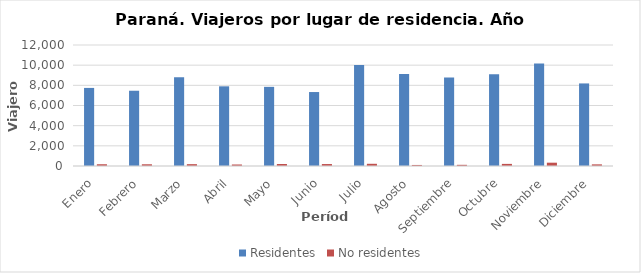
| Category | Residentes | No residentes |
|---|---|---|
| Enero | 7744 | 174 |
| Febrero | 7464 | 171 |
| Marzo | 8792 | 183 |
| Abril | 7902 | 149 |
| Mayo | 7850 | 200 |
| Junio | 7335 | 194 |
| Julio | 10010 | 219 |
| Agosto | 9134 | 103 |
| Septiembre | 8767 | 117 |
| Octubre | 9096 | 209 |
| Noviembre | 10166 | 328 |
| Diciembre | 8189 | 162 |